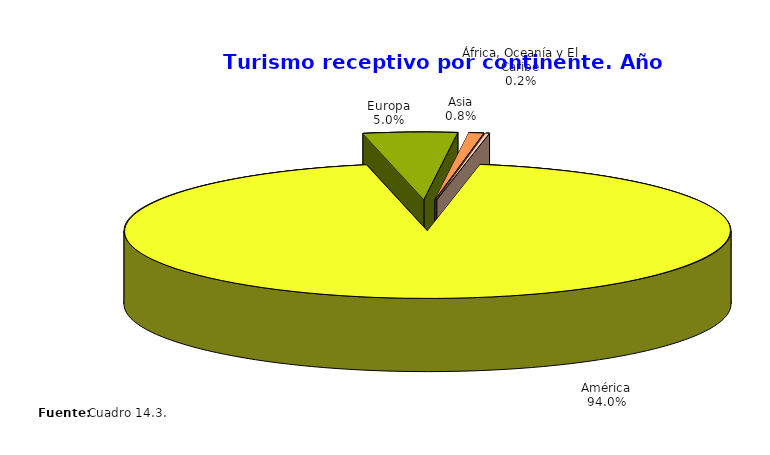
| Category | Series 0 |
|---|---|
| América | 1142736 |
| Europa | 60838 |
| Asia | 9698 |
| África, Oceanía y El Caribe | 2373 |